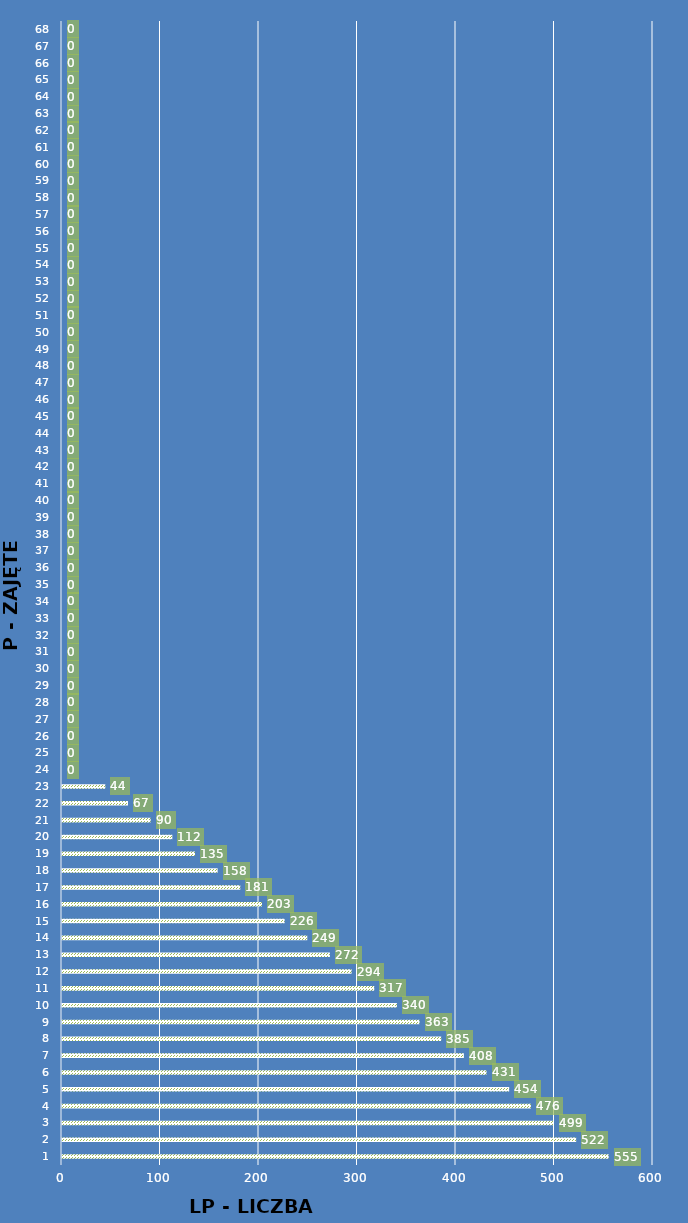
| Category | Series 1 |
|---|---|
| 0 | 555 |
| 1 | 522 |
| 2 | 499 |
| 3 | 476 |
| 4 | 454 |
| 5 | 431 |
| 6 | 408 |
| 7 | 385 |
| 8 | 363 |
| 9 | 340 |
| 10 | 317 |
| 11 | 294 |
| 12 | 272 |
| 13 | 249 |
| 14 | 226 |
| 15 | 203 |
| 16 | 181 |
| 17 | 158 |
| 18 | 135 |
| 19 | 112 |
| 20 | 90 |
| 21 | 67 |
| 22 | 44 |
| 23 | 0 |
| 24 | 0 |
| 25 | 0 |
| 26 | 0 |
| 27 | 0 |
| 28 | 0 |
| 29 | 0 |
| 30 | 0 |
| 31 | 0 |
| 32 | 0 |
| 33 | 0 |
| 34 | 0 |
| 35 | 0 |
| 36 | 0 |
| 37 | 0 |
| 38 | 0 |
| 39 | 0 |
| 40 | 0 |
| 41 | 0 |
| 42 | 0 |
| 43 | 0 |
| 44 | 0 |
| 45 | 0 |
| 46 | 0 |
| 47 | 0 |
| 48 | 0 |
| 49 | 0 |
| 50 | 0 |
| 51 | 0 |
| 52 | 0 |
| 53 | 0 |
| 54 | 0 |
| 55 | 0 |
| 56 | 0 |
| 57 | 0 |
| 58 | 0 |
| 59 | 0 |
| 60 | 0 |
| 61 | 0 |
| 62 | 0 |
| 63 | 0 |
| 64 | 0 |
| 65 | 0 |
| 66 | 0 |
| 67 | 0 |